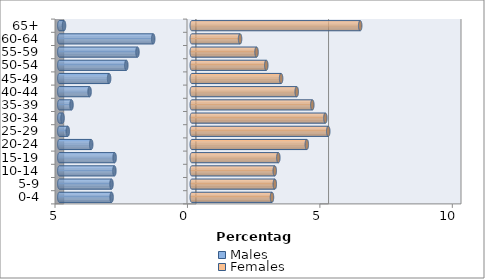
| Category | Males | Females |
|---|---|---|
| 0-4 | -3.027 | 3.027 |
| 5-9 | -3.032 | 3.134 |
| 10-14 | -2.922 | 3.132 |
| 15-19 | -2.913 | 3.268 |
| 20-24 | -3.797 | 4.343 |
| 25-29 | -4.682 | 5.153 |
| 30-34 | -4.88 | 5.044 |
| 35-39 | -4.541 | 4.551 |
| 40-44 | -3.858 | 3.962 |
| 45-49 | -3.121 | 3.373 |
| 50-54 | -2.471 | 2.812 |
| 55-59 | -2.051 | 2.445 |
| 60-64 | -1.456 | 1.823 |
| 65+ | -4.823 | 6.358 |